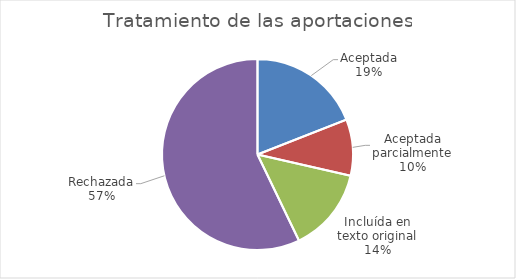
| Category | Series 0 |
|---|---|
| Aceptada | 8 |
| Aceptada parcialmente | 4 |
| Incluída en texto original | 6 |
| Rechazada | 24 |